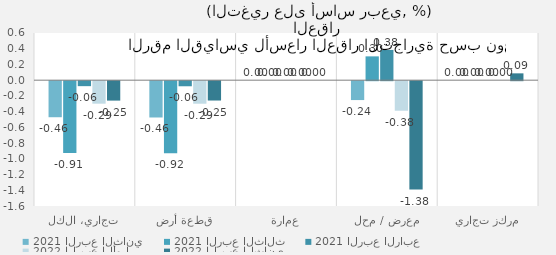
| Category | 2021 الربع الثاني | 2021 الربع الثالث | 2021 الربع الرابع | 2022 الربع الأول | 2022 الربع الثاني |
|---|---|---|---|---|---|
| تجاري، الكل | -0.458 | -0.913 | -0.063 | -0.286 | -0.247 |
| قطعة أرض | -0.462 | -0.917 | -0.065 | -0.287 | -0.246 |
| عمارة | 0 | 0 | 0 | 0 | 0 |
| معرض / محل | -0.24 | 0.303 | 0.385 | -0.376 | -1.378 |
| مركز تجاري | 0 | 0 | 0 | 0 | 0.087 |